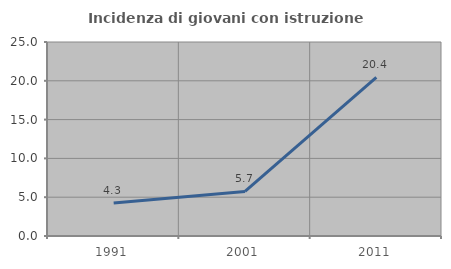
| Category | Incidenza di giovani con istruzione universitaria |
|---|---|
| 1991.0 | 4.255 |
| 2001.0 | 5.738 |
| 2011.0 | 20.43 |